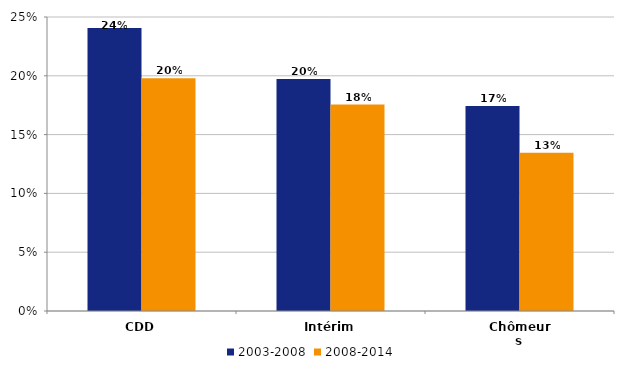
| Category | 2003-2008 | 2008-2014 |
|---|---|---|
| CDD | 0.241 | 0.198 |
| Intérim | 0.197 | 0.176 |
| Chômeurs | 0.174 | 0.135 |